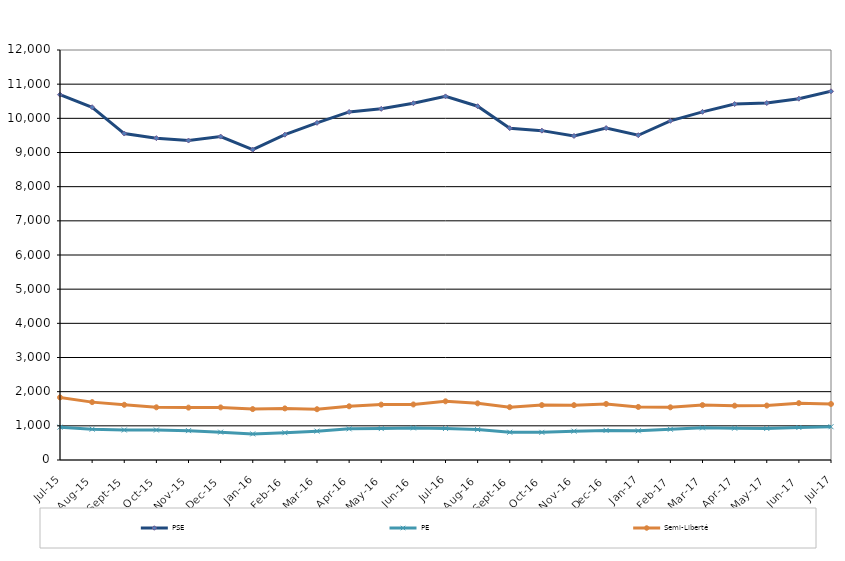
| Category | PSE | PE | Semi-Liberté |
|---|---|---|---|
| 2015-07-01 | 10692 | 961 | 1832 |
| 2015-08-01 | 10325 | 903 | 1694 |
| 2015-09-01 | 9555 | 878 | 1616 |
| 2015-10-01 | 9420 | 877 | 1542 |
| 2015-11-01 | 9350 | 859 | 1533 |
| 2015-12-01 | 9466 | 815 | 1539 |
| 2016-01-01 | 9081 | 764 | 1490 |
| 2016-02-01 | 9521 | 798 | 1510 |
| 2016-03-01 | 9868 | 845 | 1486 |
| 2016-04-01 | 10187 | 912 | 1572 |
| 2016-05-01 | 10278 | 920 | 1621 |
| 2016-06-01 | 10441 | 939 | 1625 |
| 2016-07-01 | 10642 | 923 | 1718 |
| 2016-08-01 | 10355 | 890 | 1658 |
| 2016-09-01 | 9712 | 813 | 1546 |
| 2016-10-01 | 9640 | 809 | 1607 |
| 2016-11-01 | 9484 | 844 | 1605 |
| 2016-12-01 | 9714 | 866 | 1641 |
| 2017-01-01 | 9505 | 855 | 1553 |
| 2017-02-01 | 9927 | 900 | 1542 |
| 2017-03-01 | 10190 | 942 | 1607 |
| 2017-04-01 | 10417 | 931 | 1590 |
| 2017-05-01 | 10448 | 924 | 1594 |
| 2017-06-01 | 10575 | 951 | 1664 |
| 2017-07-01 | 10791 | 974 | 1639 |